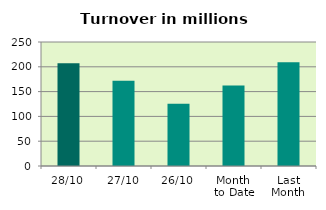
| Category | Series 0 |
|---|---|
| 28/10 | 207.225 |
| 27/10 | 171.901 |
| 26/10 | 125.442 |
| Month 
to Date | 162.375 |
| Last
Month | 209.117 |